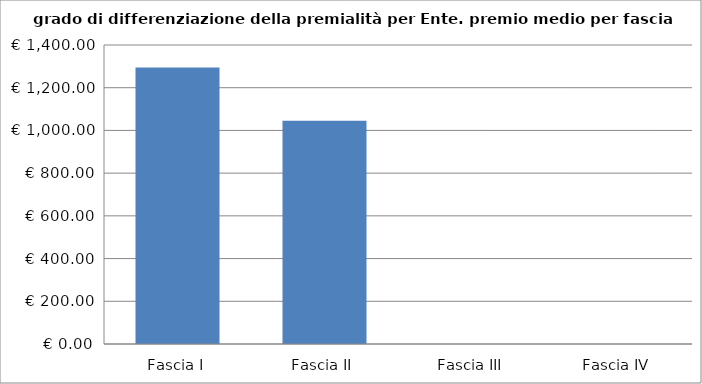
| Category | Totale ente |
|---|---|
| Fascia I | 1295.071 |
| Fascia II | 1045.79 |
| Fascia III | 0 |
| Fascia IV | 0 |